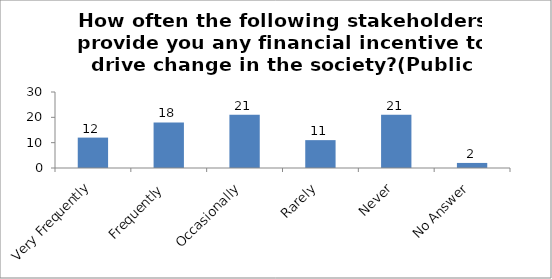
| Category | How often the following stakeholders provide you any financial incentive to drive change in the society?(Public Institutions) |
|---|---|
| Very Frequently | 12 |
| Frequently | 18 |
| Occasionally | 21 |
| Rarely | 11 |
| Never | 21 |
| No Answer | 2 |